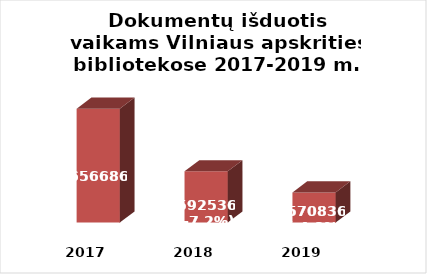
| Category | Series 0 |
|---|---|
| 2017.0 | 656686 |
| 2018.0 | 592536 |
| 2019.0 | 570836 |